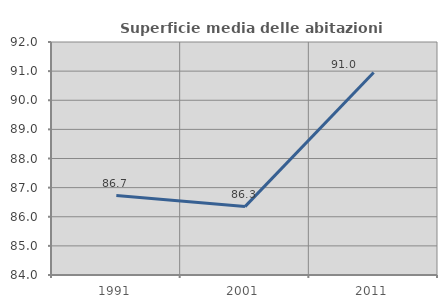
| Category | Superficie media delle abitazioni occupate |
|---|---|
| 1991.0 | 86.729 |
| 2001.0 | 86.349 |
| 2011.0 | 90.955 |